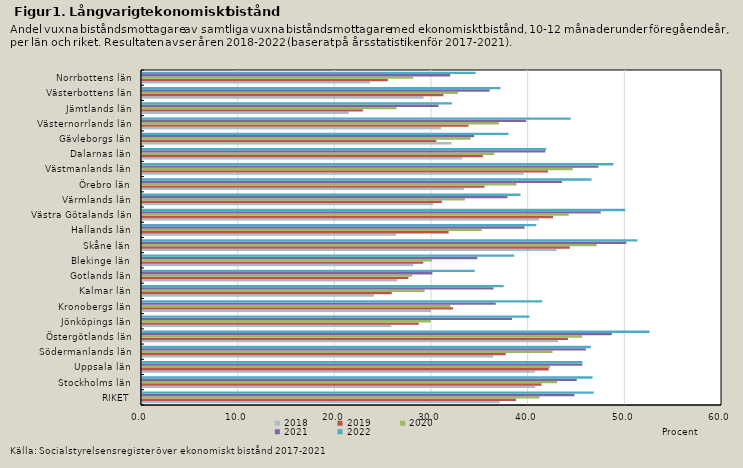
| Category | 2018 | 2019 | 2020 | 2021 | 2022 |
|---|---|---|---|---|---|
| RIKET | 37.004 | 38.691 | 41.13 | 44.738 | 46.721 |
| Stockholms län | 40.677 | 41.334 | 42.954 | 44.974 | 46.615 |
| Uppsala län | 40.672 | 42.076 | 42.194 | 45.559 | 45.552 |
| Södermanlands län | 36.32 | 37.63 | 42.465 | 45.918 | 46.423 |
| Östergötlands län | 43.049 | 44.063 | 45.53 | 48.603 | 52.496 |
| Jönköpings län | 25.798 | 28.633 | 29.863 | 38.275 | 40.072 |
| Kronobergs län | 29.885 | 32.173 | 31.904 | 36.593 | 41.409 |
| Kalmar län | 23.992 | 25.838 | 29.24 | 36.362 | 37.407 |
| Gotlands län | 26.428 | 27.552 | 27.95 | 30.038 | 34.418 |
| Blekinge län | 28.063 | 29.103 | 29.997 | 34.679 | 38.499 |
| Skåne län | 42.894 | 44.257 | 47.046 | 50.107 | 51.248 |
| Hallands län | 26.286 | 31.727 | 35.14 | 39.573 | 40.792 |
| Västra Götalands län | 41.082 | 42.519 | 44.158 | 47.46 | 49.997 |
| Värmlands län | 30.146 | 31.018 | 33.397 | 37.813 | 39.158 |
| Örebro län | 33.305 | 35.44 | 38.75 | 43.462 | 46.504 |
| Västmanlands län | 39.49 | 42.01 | 44.544 | 47.211 | 48.758 |
| Dalarnas län | 33.138 | 35.264 | 36.451 | 41.726 | 41.813 |
| Gävleborgs län | 32.004 | 30.441 | 33.997 | 34.368 | 37.909 |
| Västernorrlands län | 30.942 | 33.771 | 36.917 | 39.741 | 44.342 |
| Jämtlands län | 21.386 | 22.853 | 26.33 | 30.679 | 32.059 |
| Västerbottens län | 29.124 | 31.176 | 32.677 | 35.959 | 37.085 |
| Norrbottens län | 23.591 | 25.431 | 28.044 | 31.888 | 34.512 |